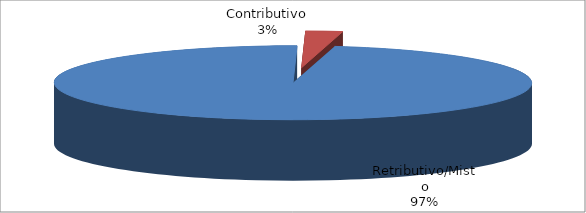
| Category | Series 1 |
|---|---|
| Retributivo/Misto | 58274 |
| Contributivo | 1498 |